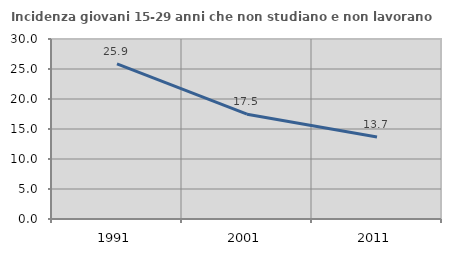
| Category | Incidenza giovani 15-29 anni che non studiano e non lavorano  |
|---|---|
| 1991.0 | 25.862 |
| 2001.0 | 17.47 |
| 2011.0 | 13.669 |